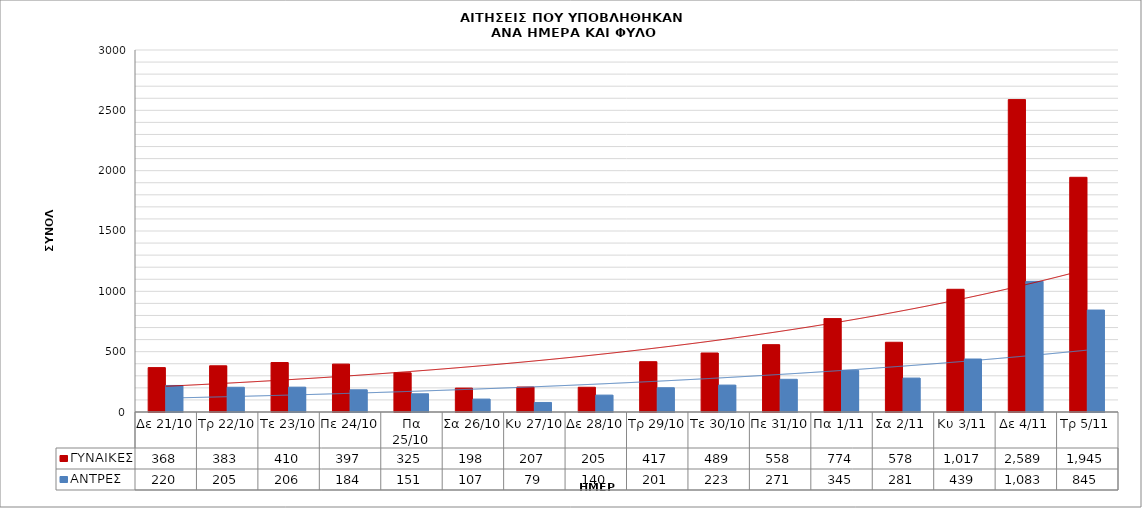
| Category | ΓΥΝΑΙΚΕΣ | ΑΝΤΡΕΣ |
|---|---|---|
| Δε 21/10 | 368 | 220 |
| Τρ 22/10 | 383 | 205 |
| Τε 23/10 | 410 | 206 |
| Πε 24/10 | 397 | 184 |
| Πα 25/10 | 325 | 151 |
| Σα 26/10 | 198 | 107 |
| Κυ 27/10 | 207 | 79 |
| Δε 28/10 | 205 | 140 |
| Τρ 29/10 | 417 | 201 |
| Τε 30/10 | 489 | 223 |
| Πε 31/10 | 558 | 271 |
| Πα 1/11 | 774 | 345 |
| Σα 2/11 | 578 | 281 |
| Κυ 3/11 | 1017 | 439 |
| Δε 4/11 | 2589 | 1083 |
| Τρ 5/11 | 1945 | 845 |